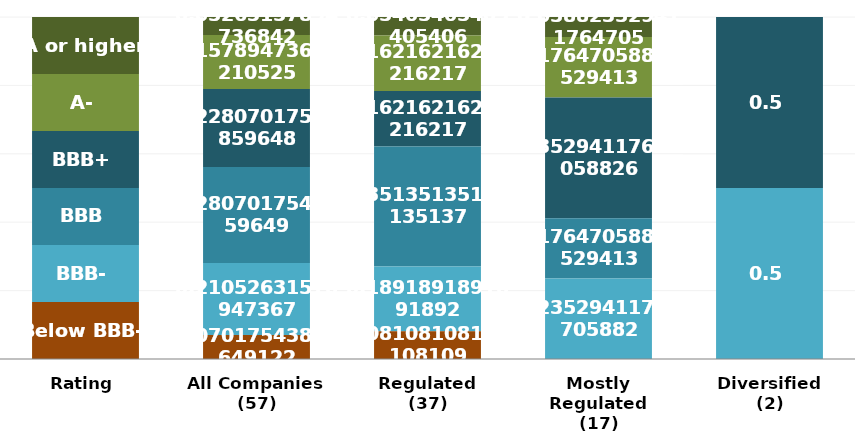
| Category | A or higher | A- | BBB+ | BBB | BBB- | Below BBB- |
|---|---|---|---|---|---|---|
| Rating | 1 | 1 | 1 | 1 | 1 | 1 |
| All Companies
(57) | 3 | 9 | 13 | 16 | 12 | 4 |
| Regulated
(37) | 2 | 6 | 6 | 13 | 7 | 3 |
| Mostly Regulated
(17) | 1 | 3 | 6 | 3 | 4 | 0 |
| Diversified
(2) | 0 | 0 | 1 | 0 | 1 | 0 |